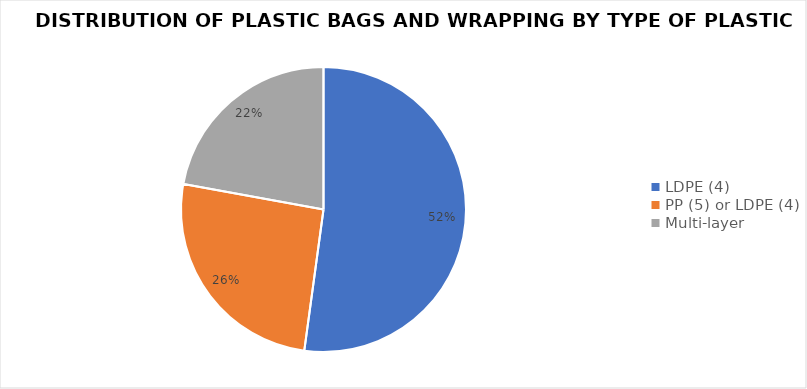
| Category | Series 0 |
|---|---|
| LDPE (4) | 90.65 |
| PP (5) or LDPE (4) | 44.697 |
| Multi-layer | 38.471 |